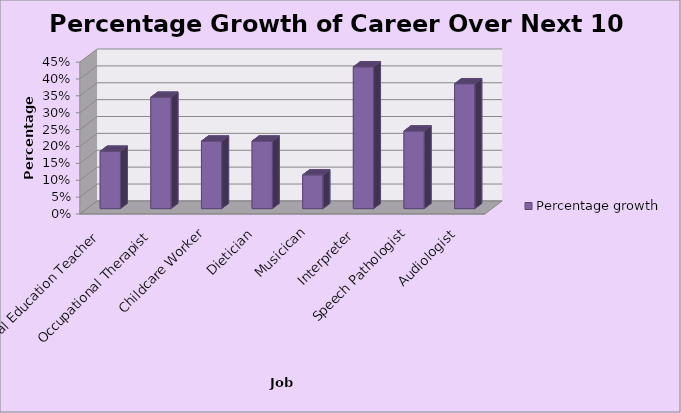
| Category | Percentage growth |
|---|---|
| Special Education Teacher | 0.17 |
| Occupational Therapist | 0.33 |
| Childcare Worker | 0.2 |
| Dietician | 0.2 |
| Musicican | 0.1 |
| Interpreter | 0.42 |
| Speech Pathologist | 0.23 |
| Audiologist | 0.37 |